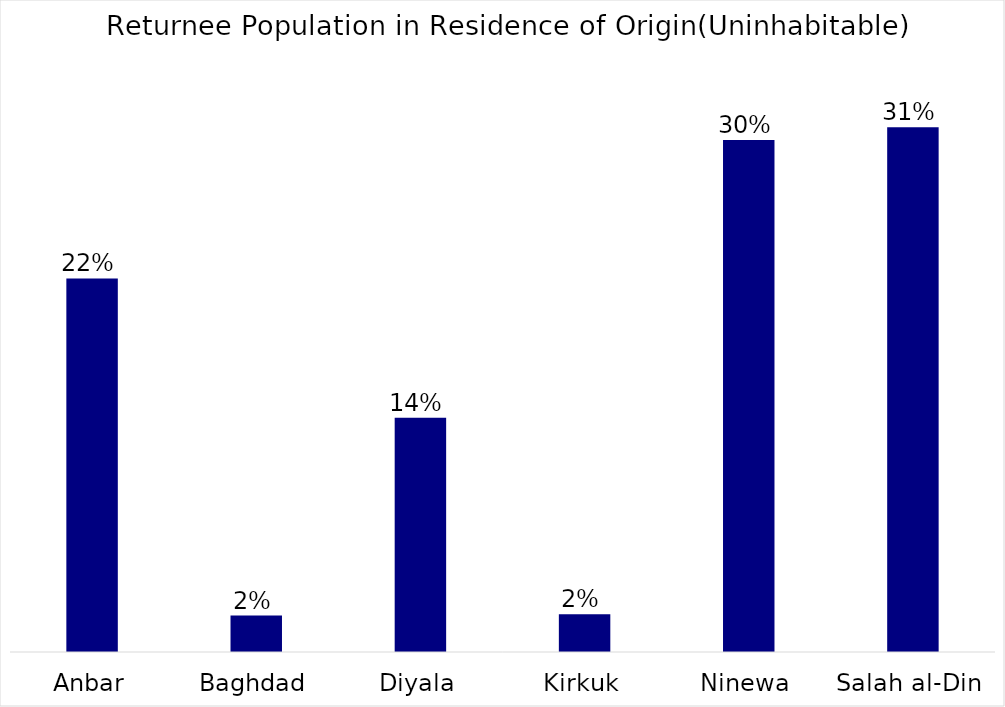
| Category | Series 0 |
|---|---|
| Anbar | 0.217 |
| Baghdad | 0.021 |
| Diyala | 0.136 |
| Kirkuk | 0.022 |
| Ninewa | 0.298 |
| Salah al-Din | 0.305 |